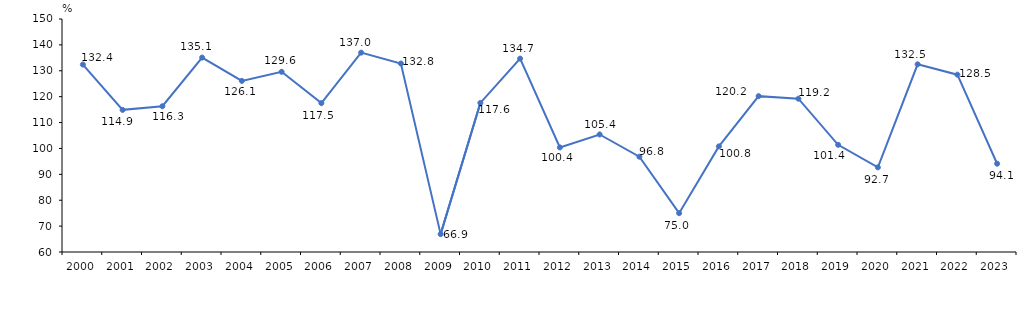
| Category | IMPORT - total |
|---|---|
| 2000.0 | 132.4 |
| 2001.0 | 114.9 |
| 2002.0 | 116.3 |
| 2003.0 | 135.1 |
| 2004.0 | 126.1 |
| 2005.0 | 129.6 |
| 2006.0 | 117.5 |
| 2007.0 | 137 |
| 2008.0 | 132.8 |
| 2009.0 | 66.9 |
| 2010.0 | 117.6 |
| 2011.0 | 134.7 |
| 2012.0 | 100.4 |
| 2013.0 | 105.4 |
| 2014.0 | 96.8 |
| 2015.0 | 75 |
| 2016.0 | 100.8 |
| 2017.0 | 120.2 |
| 2018.0 | 119.223 |
| 2019.0 | 101.4 |
| 2020.0 | 92.7 |
| 2021.0 | 132.5 |
| 2022.0 | 128.5 |
| 2023.0 | 94.1 |